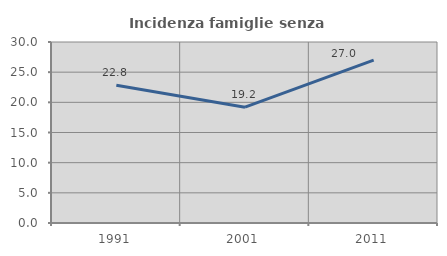
| Category | Incidenza famiglie senza nuclei |
|---|---|
| 1991.0 | 22.826 |
| 2001.0 | 19.192 |
| 2011.0 | 27 |